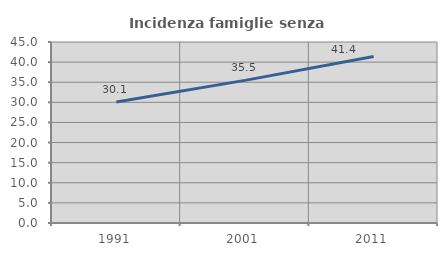
| Category | Incidenza famiglie senza nuclei |
|---|---|
| 1991.0 | 30.073 |
| 2001.0 | 35.456 |
| 2011.0 | 41.384 |